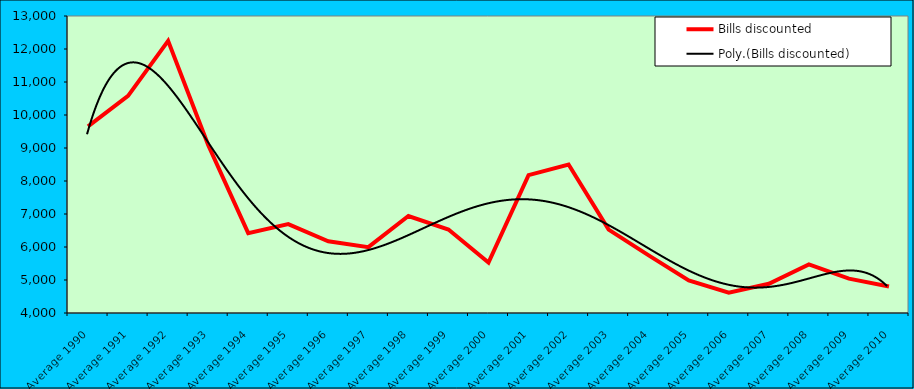
| Category | Bills discounted |
|---|---|
| Average 1990 | 9655.833 |
| Average 1991 | 10577.833 |
| Average 1992 | 12245.5 |
| Average 1993 | 9091.417 |
| Average 1994 | 6421.417 |
| Average 1995 | 6692.5 |
| Average 1996 | 6175.25 |
| Average 1997 | 5996.167 |
| Average 1998 | 6938.167 |
| Average 1999 | 6530.909 |
| Average 2000 | 5530.583 |
| Average 2001 | 8177 |
| Average 2002 | 8501.333 |
| Average 2003 | 6526.417 |
| Average 2004 | 5747 |
| Average 2005 | 4985.583 |
| Average 2006 | 4617.083 |
| Average 2007 | 4884.833 |
| Average 2008 | 5474.917 |
| Average 2009 | 5040.417 |
| Average 2010 | 4803.111 |